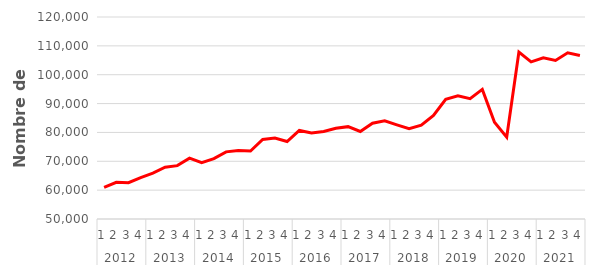
| Category | Série CVS-CJO * |
|---|---|
| 0 | 60953.19 |
| 1 | 62711.521 |
| 2 | 62577.214 |
| 3 | 64341.238 |
| 4 | 65894.151 |
| 5 | 67947.18 |
| 6 | 68497.646 |
| 7 | 71099.816 |
| 8 | 69494.529 |
| 9 | 70907.414 |
| 10 | 73269.746 |
| 11 | 73770.113 |
| 12 | 73542.387 |
| 13 | 77541.385 |
| 14 | 78033.239 |
| 15 | 76846.395 |
| 16 | 80673.658 |
| 17 | 79812.002 |
| 18 | 80319.632 |
| 19 | 81453.595 |
| 20 | 82000.769 |
| 21 | 80326.327 |
| 22 | 83186.946 |
| 23 | 84025.018 |
| 24 | 82614.995 |
| 25 | 81296.201 |
| 26 | 82511.738 |
| 27 | 85857.821 |
| 28 | 91493.295 |
| 29 | 92689.841 |
| 30 | 91706.382 |
| 31 | 94917.912 |
| 32 | 83546.304 |
| 33 | 78359.113 |
| 34 | 107868.747 |
| 35 | 104438.841 |
| 36 | 105836.63 |
| 37 | 104917.205 |
| 38 | 107613.338 |
| 39 | 106650.73 |